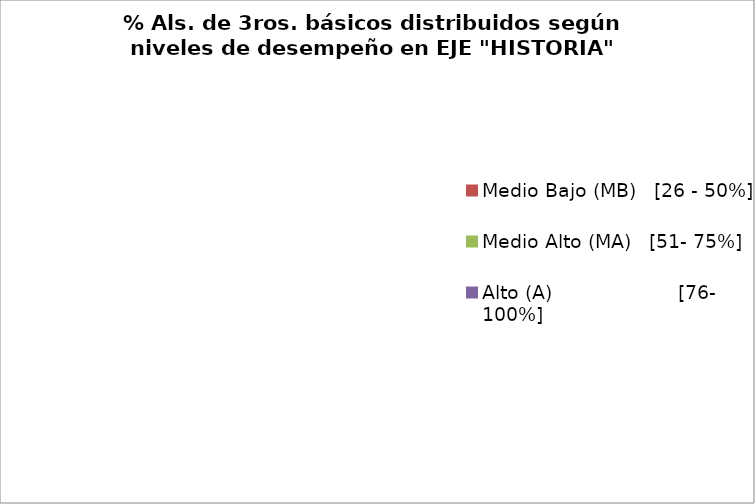
| Category | Series 0 |
|---|---|
| Bajo (B)                     [0 - 25%] | 0 |
| Medio Bajo (MB)   [26 - 50%] | 0 |
| Medio Alto (MA)   [51- 75%] | 0 |
| Alto (A)                     [76- 100%] | 0 |